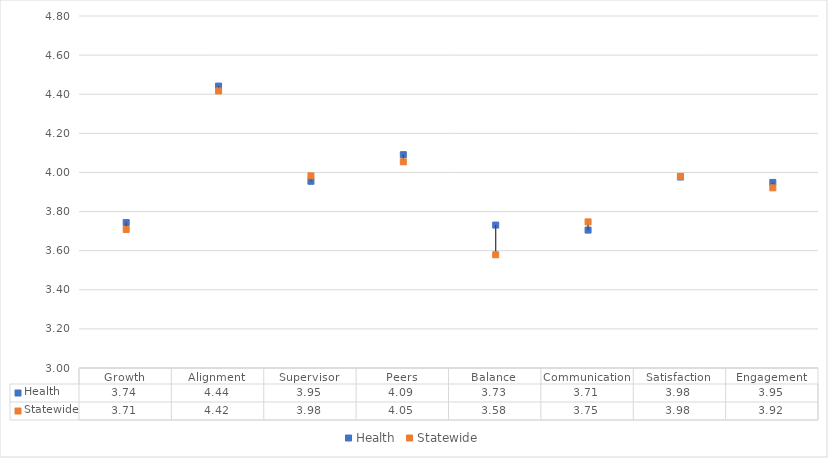
| Category | Health | Statewide |
|---|---|---|
| Growth | 3.744 | 3.708 |
| Alignment | 4.442 | 4.417 |
| Supervisor | 3.955 | 3.983 |
| Peers | 4.091 | 4.054 |
| Balance | 3.731 | 3.579 |
| Communication | 3.705 | 3.747 |
| Satisfaction | 3.977 | 3.98 |
| Engagement | 3.949 | 3.921 |